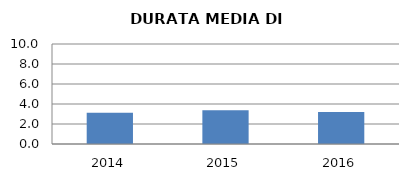
| Category | 2014 2015 2016 |
|---|---|
| 2014.0 | 3.136 |
| 2015.0 | 3.379 |
| 2016.0 | 3.2 |